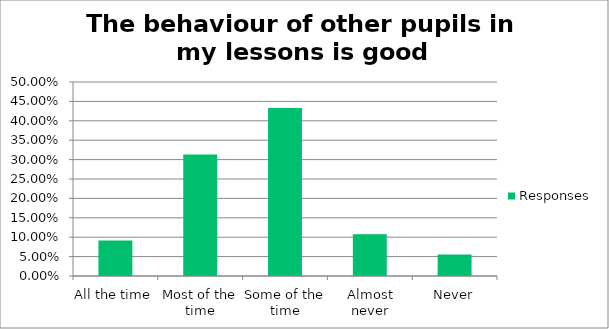
| Category | Responses |
|---|---|
| All the time | 0.091 |
| Most of the time | 0.313 |
| Some of the time | 0.433 |
| Almost never | 0.107 |
| Never | 0.056 |